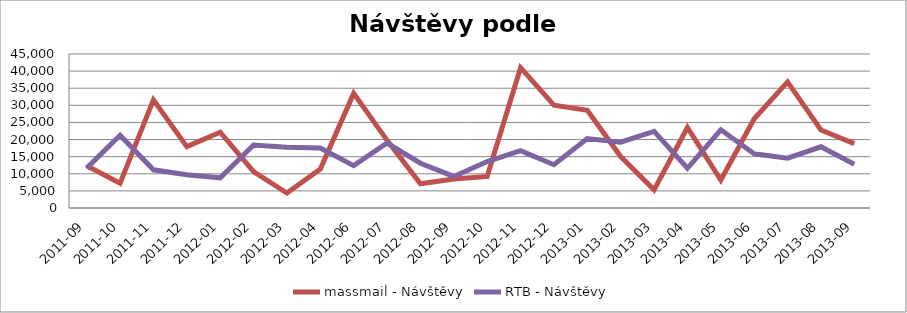
| Category | massmail - Návštěvy | RTB - Návštěvy |
|---|---|---|
| 2011-09 | 12327.664 | 11660.346 |
| 2011-10 | 7216.225 | 21241.74 |
| 2011-11 | 31600.733 | 11151.279 |
| 2011-12 | 17940.773 | 9714.827 |
| 2012-01 | 22139.884 | 8817.337 |
| 2012-02 | 10645.169 | 18385.759 |
| 2012-03 | 4385.495 | 17779.443 |
| 2012-04 | 11361.202 | 17550.933 |
| 2012-06 | 33484.188 | 12367.078 |
| 2012-07 | 19762.313 | 18982.37 |
| 2012-08 | 7074.53 | 13084.494 |
| 2012-09 | 8445.879 | 9220.629 |
| 2012-10 | 9235.156 | 13580.956 |
| 2012-11 | 41000.57 | 16740.36 |
| 2012-12 | 30069.364 | 12656.799 |
| 2013-01 | 28521.089 | 20303.037 |
| 2013-02 | 15032.705 | 19229.892 |
| 2013-03 | 5301.52 | 22417.667 |
| 2013-04 | 23525.113 | 11605.76 |
| 2013-05 | 8136.313 | 22862.335 |
| 2013-06 | 26073.192 | 15854.025 |
| 2013-07 | 36834.952 | 14546.294 |
| 2013-08 | 22787.702 | 17891.345 |
| 2013-09 | 18793.846 | 12804.919 |